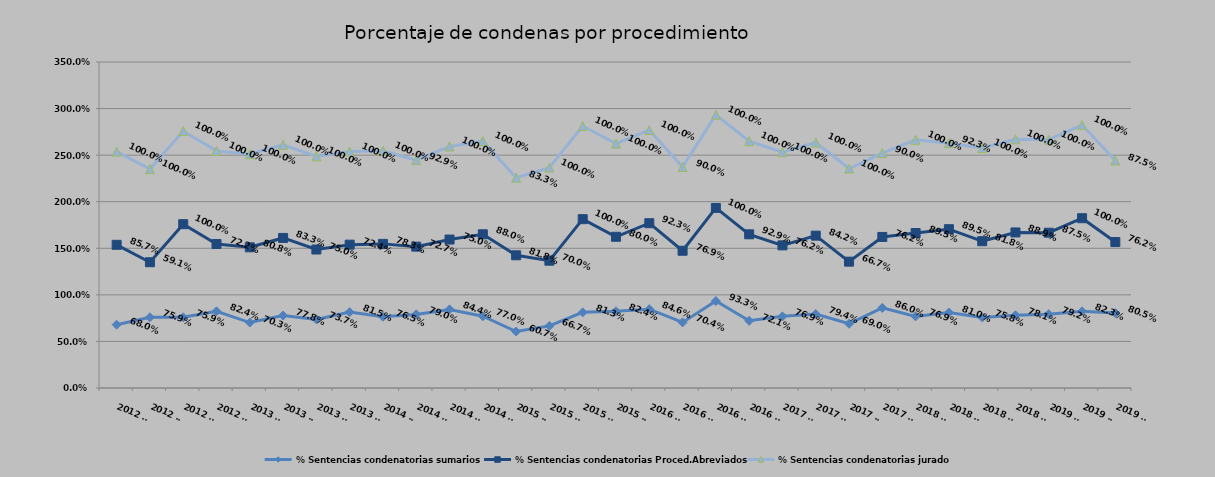
| Category | % Sentencias condenatorias sumarios | % Sentencias condenatorias Proced.Abreviados | % Sentencias condenatorias jurado |
|---|---|---|---|
| 2012 T1 | 0.68 | 0.857 | 1 |
| 2012 T2 | 0.759 | 0.591 | 1 |
| 2012 T3 | 0.759 | 1 | 1 |
| 2012 T4 | 0.824 | 0.722 | 1 |
| 2013 T1 | 0.703 | 0.808 | 1 |
| 2013 T2 | 0.778 | 0.833 | 1 |
| 2013 T3 | 0.737 | 0.75 | 1 |
| 2013 T4 | 0.815 | 0.724 | 1 |
| 2014 T1 | 0.765 | 0.783 | 1 |
| 2014 T2 | 0.79 | 0.727 | 0.929 |
| 2014 T3 | 0.844 | 0.75 | 1 |
| 2014 T4 | 0.77 | 0.88 | 1 |
| 2015 T1 | 0.607 | 0.818 | 0.833 |
| 2015 T2 | 0.667 | 0.7 | 1 |
| 2015 T3 | 0.812 | 1 | 1 |
| 2015 T4 | 0.824 | 0.8 | 1 |
| 2016 T1 | 0.846 | 0.923 | 1 |
| 2016 T2 | 0.704 | 0.769 | 0.9 |
| 2016 T3 | 0.933 | 1 | 1 |
| 2016 T4 | 0.721 | 0.929 | 1 |
| 2017 T1 | 0.769 | 0.762 | 1 |
| 2017 T2 | 0.794 | 0.842 | 1 |
| 2017 T3 | 0.69 | 0.667 | 1 |
| 2017 T4 | 0.86 | 0.762 | 0.9 |
| 2018 T1 | 0.769 | 0.895 | 1 |
| 2018 T2 | 0.81 | 0.895 | 0.923 |
| 2018 T3 | 0.758 | 0.818 | 1 |
| 2018 T4 | 0.781 | 0.889 | 1 |
| 2019 T1 | 0.792 | 0.875 | 1 |
| 2019 T2 | 0.823 | 1 | 1 |
| 2019 T3 | 0.805 | 0.762 | 0.875 |